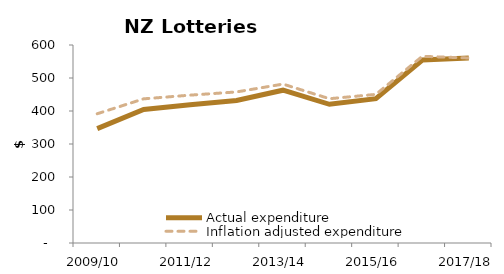
| Category | Actual expenditure | Inflation adjusted expenditure |
|---|---|---|
| 2009/10 | 346.622 | 391.683 |
| 2010/11 | 404.477 | 436.835 |
| 2011/12 | 418.739 | 448.051 |
| 2012/13 | 431.824 | 457.733 |
| 2013/14 | 463.06 | 481.582 |
| 2014/15 | 420.377 | 437.192 |
| 2015/16 | 437.262 | 450.38 |
| 2016/17 | 554.651 | 565.744 |
| 2017/18 | 560.611 | 560.611 |